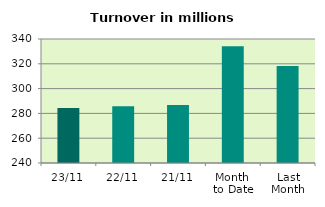
| Category | Series 0 |
|---|---|
| 23/11 | 284.377 |
| 22/11 | 285.76 |
| 21/11 | 286.834 |
| Month 
to Date | 334.154 |
| Last
Month | 318.176 |